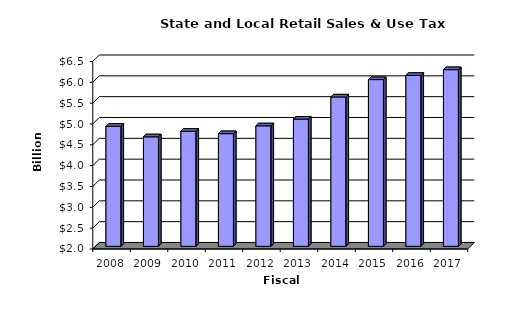
| Category | Series 0 |
|---|---|
| 2008.0 | 4.88 |
| 2009.0 | 4.628 |
| 2010.0 | 4.762 |
| 2011.0 | 4.704 |
| 2012.0 | 4.891 |
| 2013.0 | 5.052 |
| 2014.0 | 5.585 |
| 2015.0 | 6.001 |
| 2016.0 | 6.102 |
| 2017.0 | 6.24 |